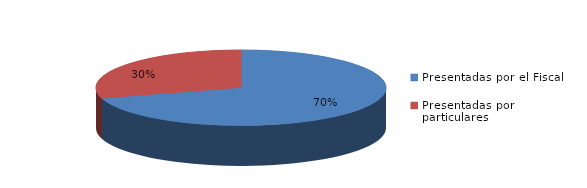
| Category | Series 0 |
|---|---|
| Presentadas por el Fiscal | 259 |
| Presentadas por particulares | 109 |